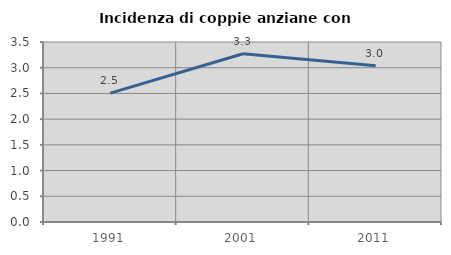
| Category | Incidenza di coppie anziane con figli |
|---|---|
| 1991.0 | 2.506 |
| 2001.0 | 3.271 |
| 2011.0 | 3.038 |